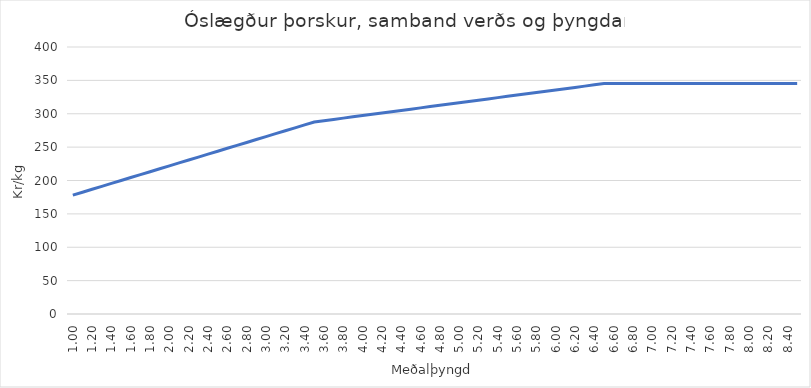
| Category | Series 0 |
|---|---|
| 1.0 | 178.1 |
| 1.1 | 182.484 |
| 1.2 | 186.868 |
| 1.3 | 191.252 |
| 1.4 | 195.636 |
| 1.5 | 200.02 |
| 1.6 | 204.404 |
| 1.7 | 208.788 |
| 1.8 | 213.172 |
| 1.9 | 217.556 |
| 2.0 | 221.941 |
| 2.1 | 226.325 |
| 2.2 | 230.709 |
| 2.3 | 235.093 |
| 2.4 | 239.477 |
| 2.5 | 243.861 |
| 2.6 | 248.245 |
| 2.7 | 252.629 |
| 2.8 | 257.013 |
| 2.9 | 261.397 |
| 3.0 | 265.781 |
| 3.1 | 270.165 |
| 3.2 | 274.549 |
| 3.3 | 278.933 |
| 3.4 | 283.317 |
| 3.5 | 287.701 |
| 3.6 | 289.619 |
| 3.7 | 291.537 |
| 3.8 | 293.455 |
| 3.9 | 295.373 |
| 4.0 | 297.291 |
| 4.1 | 299.209 |
| 4.2 | 301.127 |
| 4.3 | 303.045 |
| 4.4 | 304.963 |
| 4.5 | 306.881 |
| 4.6 | 308.799 |
| 4.7 | 310.717 |
| 4.8 | 312.635 |
| 4.9 | 314.553 |
| 5.0 | 316.471 |
| 5.1 | 318.389 |
| 5.2 | 320.307 |
| 5.3 | 322.225 |
| 5.4 | 324.143 |
| 5.5 | 326.061 |
| 5.6 | 327.979 |
| 5.7 | 329.897 |
| 5.8 | 331.815 |
| 5.9 | 333.733 |
| 6.0 | 335.651 |
| 6.1 | 337.569 |
| 6.2 | 339.487 |
| 6.3 | 341.405 |
| 6.4 | 343.323 |
| 6.50000000000001 | 345.241 |
| 6.6 | 345.241 |
| 6.7 | 345.241 |
| 6.80000000000001 | 345.241 |
| 6.90000000000001 | 345.241 |
| 7.00000000000001 | 345.241 |
| 7.100000000000009 | 345.241 |
| 7.200000000000009 | 345.241 |
| 7.300000000000009 | 345.241 |
| 7.400000000000008 | 345.241 |
| 7.500000000000008 | 345.241 |
| 7.600000000000008 | 345.241 |
| 7.700000000000007 | 345.241 |
| 7.800000000000007 | 345.241 |
| 7.900000000000007 | 345.241 |
| 8.000000000000007 | 345.241 |
| 8.100000000000007 | 345.241 |
| 8.200000000000006 | 345.241 |
| 8.300000000000006 | 345.241 |
| 8.400000000000006 | 345.241 |
| 8.500000000000005 | 345.241 |